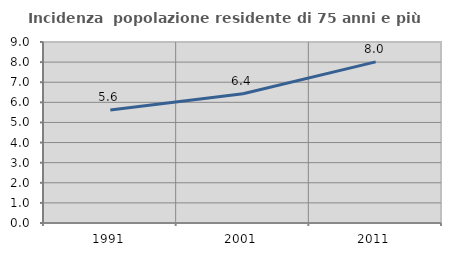
| Category | Incidenza  popolazione residente di 75 anni e più |
|---|---|
| 1991.0 | 5.618 |
| 2001.0 | 6.429 |
| 2011.0 | 8.013 |